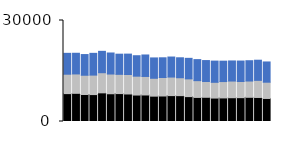
| Category | East |
|---|---|
| 0 | 6203 |
| 1 | 6141 |
| 2 | 6147 |
| 3 | 6465 |
| 4 | 6349 |
| 5 | 6249 |
| 6 | 5988 |
| 7 | 6064 |
| 8 | 6076 |
| 9 | 6382 |
| 10 | 6045 |
| 11 | 5862 |
| 12 | 5953 |
| 13 | 5928 |
| 14 | 6095 |
| 15 | 6251 |
| 16 | 6211 |
| 17 | 6307 |
| 18 | 6059 |
| 19 | 5972 |
| 20 | 6074 |
| 21 | 6036 |
| 22 | 5986 |
| 23 | 6015 |